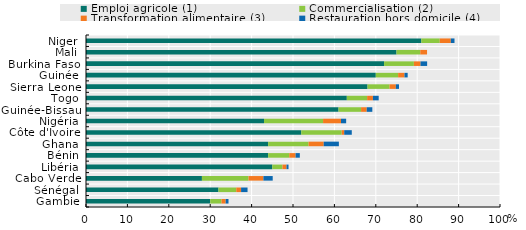
| Category | Emploi agricole (1) | Commercialisation (2) | Transformation alimentaire (3) | Restauration hors domicile (4) |
|---|---|---|---|---|
| Gambie | 30 | 2.72 | 1.02 | 0.68 |
| Sénégal | 32 | 4.29 | 1.17 | 1.56 |
| Cabo Verde | 28 | 11.25 | 3.6 | 2.25 |
| Libéria | 45 | 2.45 | 0.98 | 0.49 |
| Bénin | 44 | 5.1 | 1.53 | 1.02 |
| Ghana | 44 | 9.76 | 3.66 | 3.66 |
| Côte d'Ivoire | 52 | 9.76 | 0.61 | 1.83 |
| Nigéria | 43 | 14.26 | 4.34 | 1.24 |
| Guinée-Bissau | 61 | 5.44 | 1.36 | 1.36 |
| Togo | 63 | 4.9 | 1.4 | 1.4 |
| Sierra Leone | 68 | 5.32 | 1.52 | 0.76 |
| Guinée | 70 | 5.39 | 1.54 | 0.77 |
| Burkina Faso | 72 | 7.2 | 1.6 | 1.6 |
| Mali | 75 | 5.74 | 1.64 | 0 |
| Niger | 81 | 4.45 | 2.67 | 0.89 |